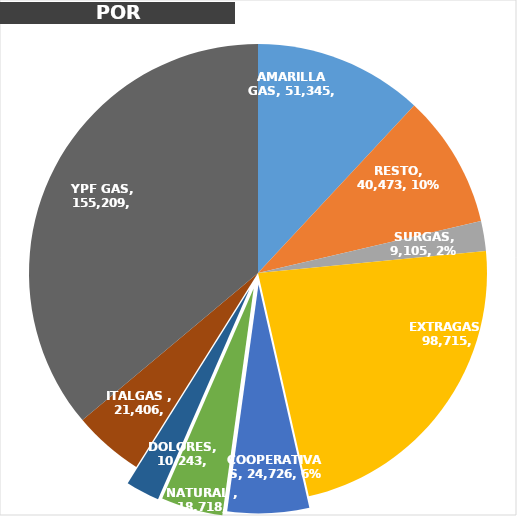
| Category | Series 0 |
|---|---|
| AMARILLA GAS | 51344.58 |
| RESTO | 40472.73 |
| SURGAS | 9104.72 |
| EXTRAGAS | 98715.19 |
| COOPERATIVAS | 24725.85 |
| NATURAL  | 18718.32 |
| DOLORES | 10243.28 |
| ITALGAS  | 21405.77 |
| YPF GAS | 155208.67 |